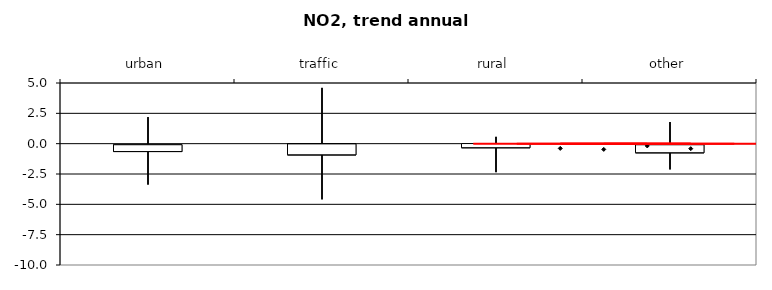
| Category | 25% | min | max | 75% |
|---|---|---|---|---|
| urban | -0.648 | -3.369 | 2.19 | -0.089 |
| traffic | -0.917 | -4.586 | 4.597 | -0.018 |
| rural | -0.33 | -2.349 | 0.561 | 0.011 |
| other | -0.747 | -2.118 | 1.782 | -0.091 |